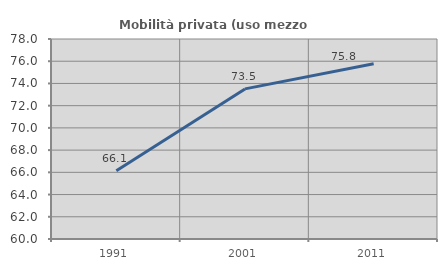
| Category | Mobilità privata (uso mezzo privato) |
|---|---|
| 1991.0 | 66.147 |
| 2001.0 | 73.51 |
| 2011.0 | 75.78 |